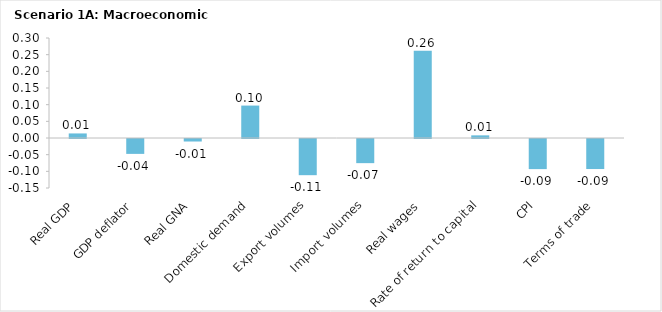
| Category | Series 0 |
|---|---|
| Real GDP | 0.014 |
| GDP deflator | -0.045 |
| Real GNA | -0.008 |
| Domestic demand | 0.097 |
| Export volumes | -0.109 |
| Import volumes | -0.072 |
| Real wages | 0.262 |
| Rate of return to capital | 0.008 |
| CPI | -0.09 |
| Terms of trade | -0.09 |